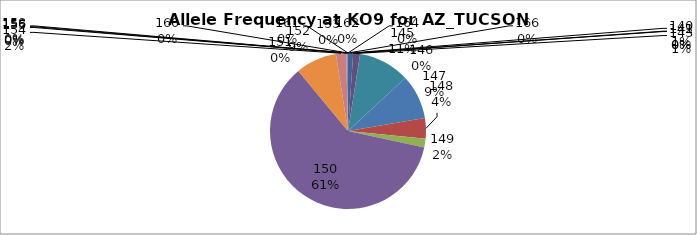
| Category | Series 0 |
|---|---|
| 140.0 | 0.011 |
| 141.0 | 0 |
| 142.0 | 0 |
| 143.0 | 0.014 |
| 145.0 | 0.106 |
| 146.0 | 0 |
| 147.0 | 0.092 |
| 148.0 | 0.043 |
| 149.0 | 0.018 |
| 150.0 | 0.606 |
| 151.0 | 0 |
| 152.0 | 0.085 |
| 153.0 | 0 |
| 154.0 | 0.021 |
| 155.0 | 0 |
| 156.0 | 0.004 |
| 158.0 | 0 |
| 160.0 | 0 |
| 161.0 | 0 |
| 162.0 | 0 |
| 164.0 | 0 |
| 166.0 | 0 |